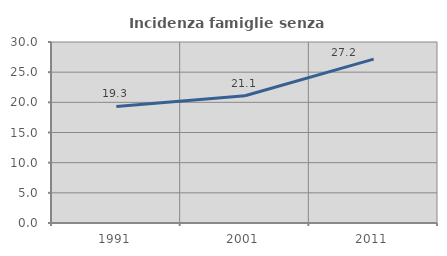
| Category | Incidenza famiglie senza nuclei |
|---|---|
| 1991.0 | 19.327 |
| 2001.0 | 21.094 |
| 2011.0 | 27.169 |